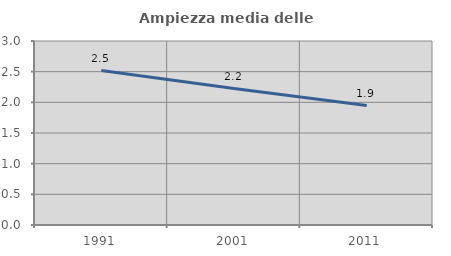
| Category | Ampiezza media delle famiglie |
|---|---|
| 1991.0 | 2.518 |
| 2001.0 | 2.225 |
| 2011.0 | 1.947 |